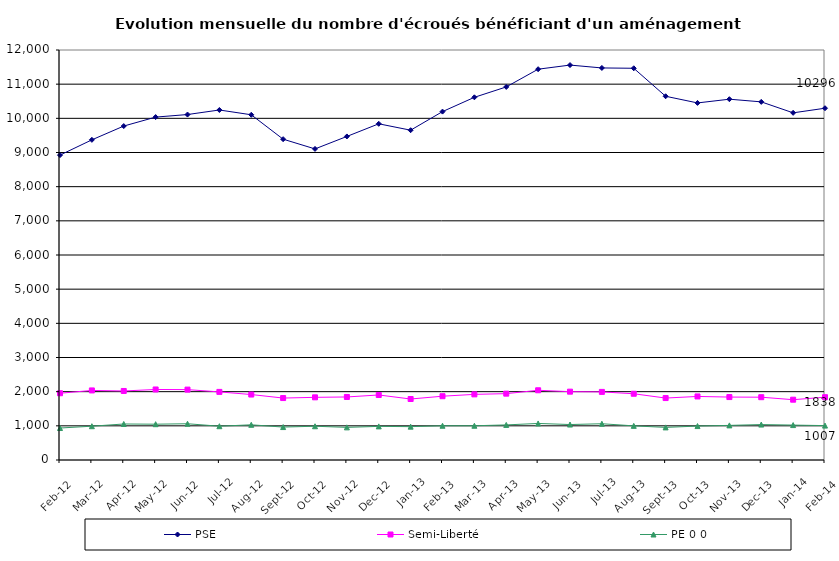
| Category | PSE | Semi-Liberté | PE 0 0 |
|---|---|---|---|
| 2012-02-01 | 8924 | 1954 | 936 |
| 2012-03-01 | 9370 | 2036 | 989 |
| 2012-04-01 | 9774 | 2020 | 1054 |
| 2012-05-01 | 10036 | 2064 | 1048 |
| 2012-06-01 | 10111 | 2060 | 1061 |
| 2012-07-01 | 10244 | 1993 | 989 |
| 2012-08-01 | 10104 | 1916 | 1030 |
| 2012-09-01 | 9390 | 1813 | 964 |
| 2012-10-01 | 9105 | 1834 | 988 |
| 2012-11-01 | 9470 | 1845 | 955 |
| 2012-12-01 | 9840 | 1903 | 984 |
| 2013-01-01 | 9653 | 1785 | 976 |
| 2013-02-01 | 10197 | 1867 | 1002 |
| 2013-03-01 | 10615 | 1921 | 1002 |
| 2013-04-01 | 10919 | 1942 | 1027 |
| 2013-05-01 | 11438 | 2041 | 1070 |
| 2013-06-01 | 11559 | 2000 | 1038 |
| 2013-07-01 | 11475 | 1993 | 1061 |
| 2013-08-01 | 11465 | 1939 | 999 |
| 2013-09-01 | 10646 | 1813 | 954 |
| 2013-10-01 | 10451 | 1860 | 993 |
| 2013-11-01 | 10560 | 1842 | 1013 |
| 2013-12-01 | 10482 | 1838 | 1037 |
| 2014-01-01 | 10161 | 1765 | 1022 |
| 2014-02-01 | 10296 | 1838 | 1007 |